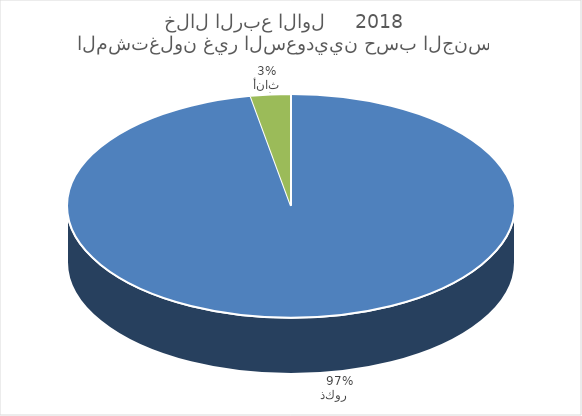
| Category | Series 0 |
|---|---|
| ذكور    | 4460983 |
| أناث | 133015 |